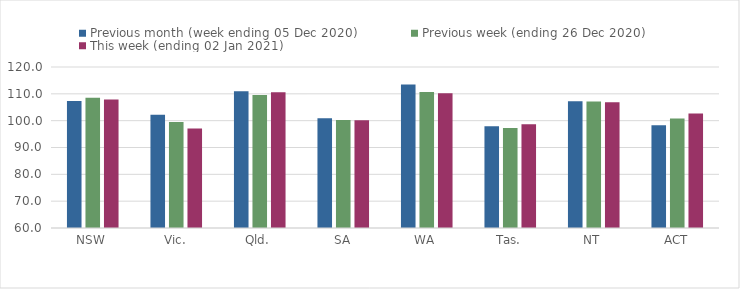
| Category | Previous month (week ending 05 Dec 2020) | Previous week (ending 26 Dec 2020) | This week (ending 02 Jan 2021) |
|---|---|---|---|
| NSW | 107.35 | 108.52 | 107.91 |
| Vic. | 102.18 | 99.46 | 97.04 |
| Qld. | 110.94 | 109.58 | 110.56 |
| SA | 100.86 | 100.25 | 100.16 |
| WA | 113.52 | 110.69 | 110.25 |
| Tas. | 97.89 | 97.29 | 98.68 |
| NT | 107.27 | 107.15 | 106.83 |
| ACT | 98.3 | 100.85 | 102.69 |